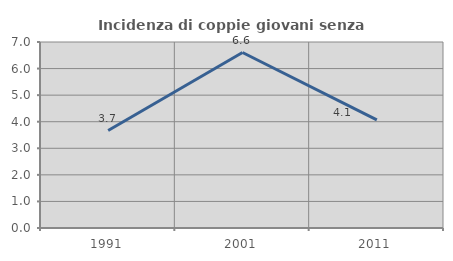
| Category | Incidenza di coppie giovani senza figli |
|---|---|
| 1991.0 | 3.667 |
| 2001.0 | 6.604 |
| 2011.0 | 4.068 |